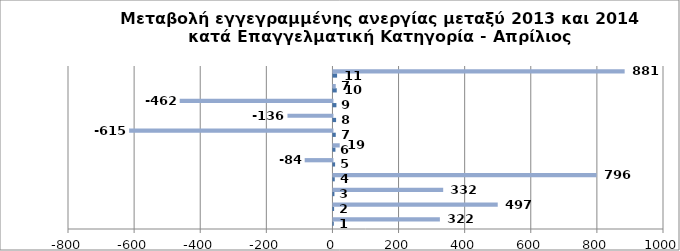
| Category | Series 0 | Series 1 |
|---|---|---|
| 0 | 1 | 322 |
| 1 | 2 | 497 |
| 2 | 3 | 332 |
| 3 | 4 | 796 |
| 4 | 5 | -84 |
| 5 | 6 | 19 |
| 6 | 7 | -615 |
| 7 | 8 | -136 |
| 8 | 9 | -462 |
| 9 | 10 | 7 |
| 10 | 11 | 881 |